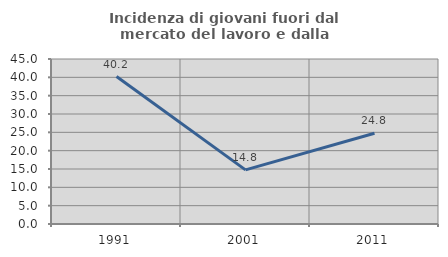
| Category | Incidenza di giovani fuori dal mercato del lavoro e dalla formazione  |
|---|---|
| 1991.0 | 40.219 |
| 2001.0 | 14.758 |
| 2011.0 | 24.762 |